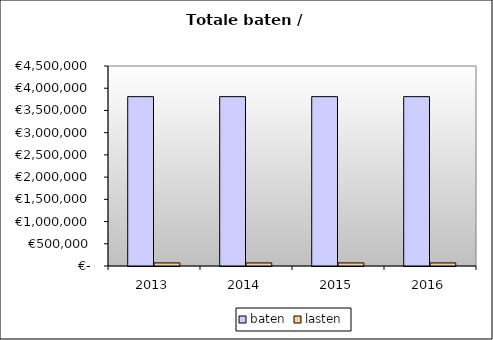
| Category | baten | lasten |
|---|---|---|
| 2013.0 | 3810248.16 | 69062.4 |
| 2014.0 | 3810248.16 | 69062.4 |
| 2015.0 | 3810248.16 | 69062.4 |
| 2016.0 | 3810248.16 | 69062.4 |